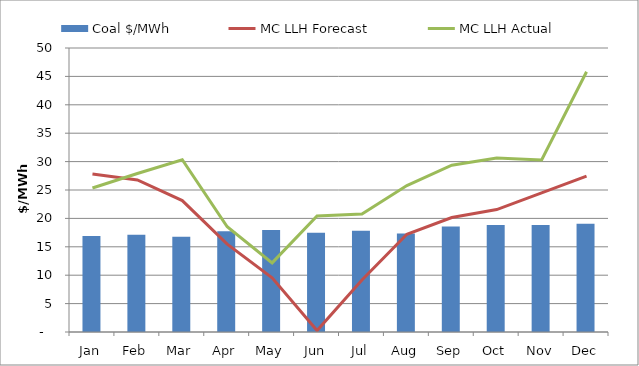
| Category | Coal $/MWh |
|---|---|
| Jan | 16.916 |
| Feb | 17.123 |
| Mar | 16.76 |
| Apr | 17.733 |
| May | 17.963 |
| Jun | 17.46 |
| Jul | 17.841 |
| Aug | 17.345 |
| Sep | 18.588 |
| Oct | 18.819 |
| Nov | 18.834 |
| Dec | 19.079 |